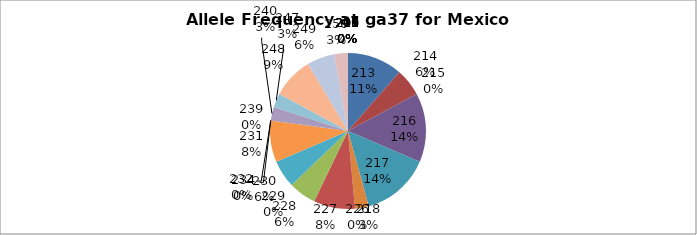
| Category | Series 0 |
|---|---|
| 207.0 | 0 |
| 208.0 | 0 |
| 209.0 | 0 |
| 210.0 | 0 |
| 211.0 | 0 |
| 212.0 | 0 |
| 213.0 | 0.114 |
| 214.0 | 0.057 |
| 215.0 | 0 |
| 216.0 | 0.143 |
| 217.0 | 0.143 |
| 218.0 | 0.029 |
| 226.0 | 0 |
| 227.0 | 0.086 |
| 228.0 | 0.057 |
| 229.0 | 0 |
| 230.0 | 0.057 |
| 231.0 | 0.086 |
| 232.0 | 0 |
| 234.0 | 0 |
| 239.0 | 0 |
| 240.0 | 0.029 |
| 247.0 | 0.029 |
| 248.0 | 0.086 |
| 249.0 | 0.057 |
| 250.0 | 0.029 |